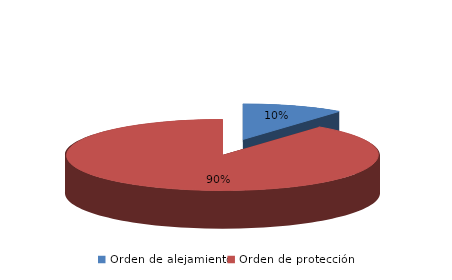
| Category | Series 0 |
|---|---|
| Orden de alejamiento | 116 |
| Orden de protección | 992 |